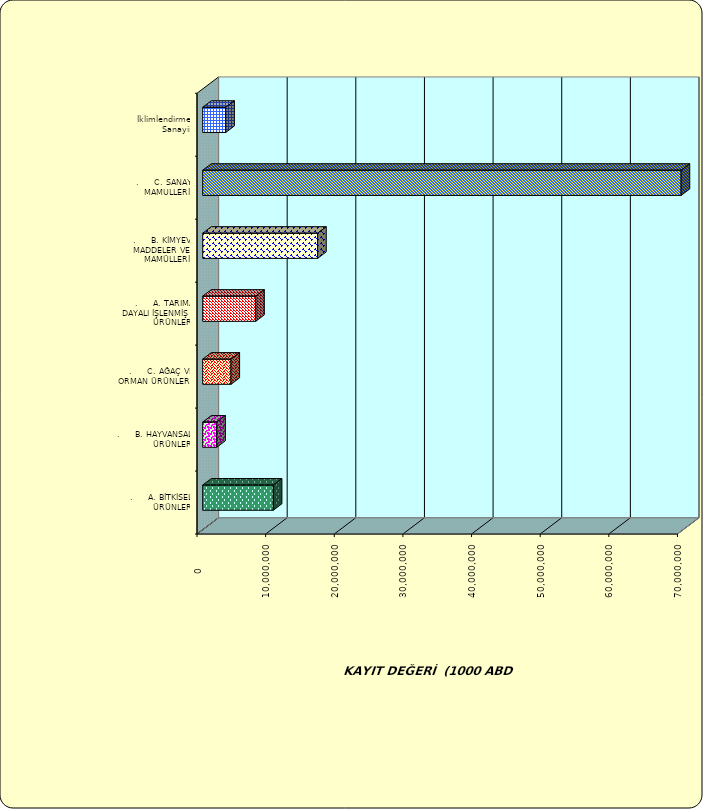
| Category | Series 0 |
|---|---|
| .     A. BİTKİSEL ÜRÜNLER | 10287330.668 |
| .     B. HAYVANSAL ÜRÜNLER | 2052904.101 |
| .     C. AĞAÇ VE ORMAN ÜRÜNLERİ | 4122690.765 |
| .     A. TARIMA DAYALI İŞLENMİŞ ÜRÜNLER | 7725885.859 |
| .     B. KİMYEVİ MADDELER VE MAMÜLLERİ | 16748425.252 |
| .     C. SANAYİ MAMULLERİ | 69705745.906 |
|  İklimlendirme Sanayii | 3363880.779 |